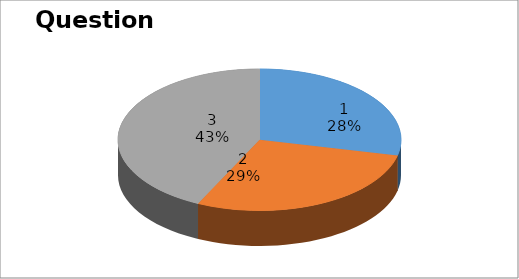
| Category | Series 0 |
|---|---|
| 0 | 4 |
| 1 | 4 |
| 2 | 6 |